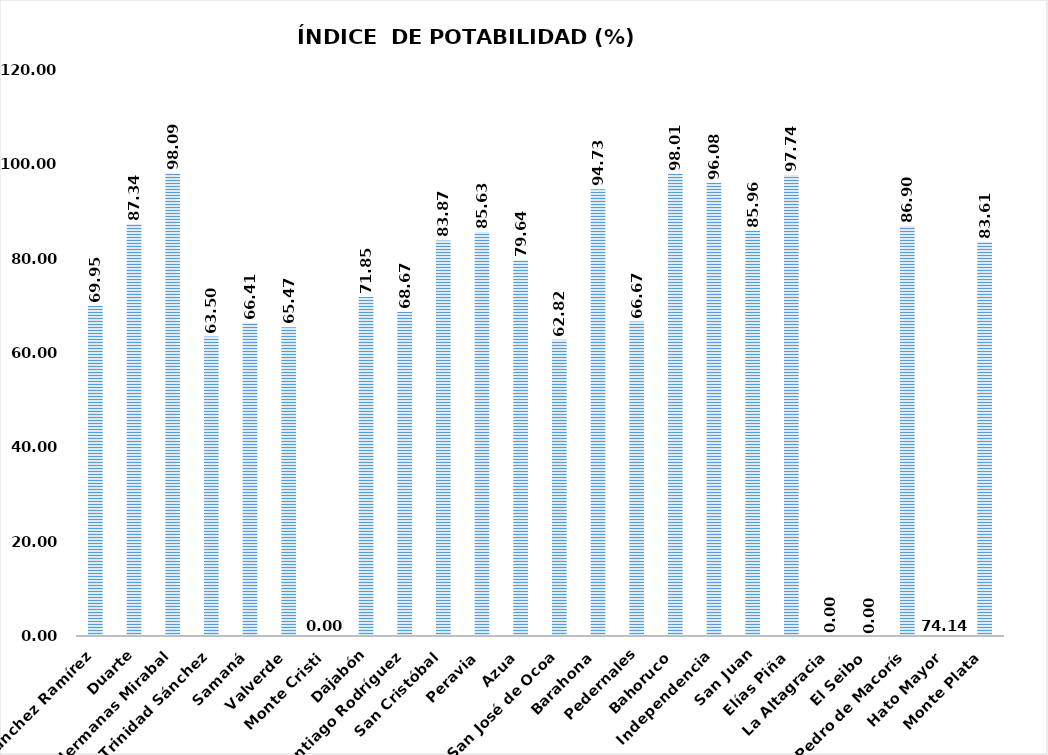
| Category | 69.95   |
|---|---|
| Sánchez Ramírez | 69.953 |
| Duarte | 87.342 |
| Hermanas Mirabal | 98.088 |
| María Trinidad Sánchez | 63.498 |
| Samaná | 66.409 |
| Valverde | 65.471 |
| Monte Cristi | 0 |
| Dajabón | 71.853 |
| Santiago Rodríguez | 68.674 |
| San Cristóbal | 83.871 |
| Peravia | 85.633 |
| Azua | 79.639 |
| San José de Ocoa | 62.817 |
| Barahona | 94.726 |
| Pedernales | 66.667 |
| Bahoruco | 98.01 |
| Independencia | 96.078 |
| San Juan | 85.965 |
| Elías Piña | 97.738 |
| La Altagracia | 0 |
| El Seibo | 0 |
| San Pedro de Macorís | 86.905 |
| Hato Mayor | 0 |
| Monte Plata | 83.613 |